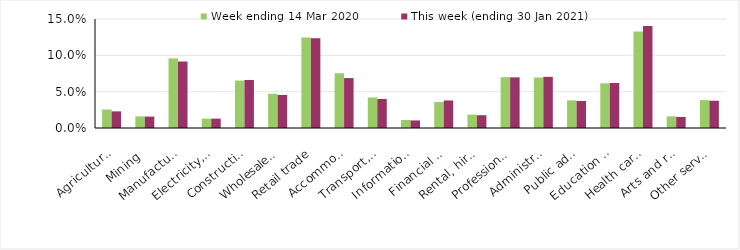
| Category | Week ending 14 Mar 2020 | This week (ending 30 Jan 2021) |
|---|---|---|
| Agriculture, forestry and fishing | 0.025 | 0.023 |
| Mining | 0.016 | 0.016 |
| Manufacturing | 0.096 | 0.092 |
| Electricity, gas, water and waste services | 0.013 | 0.013 |
| Construction | 0.065 | 0.066 |
| Wholesale trade | 0.047 | 0.046 |
| Retail trade | 0.125 | 0.124 |
| Accommodation and food services | 0.075 | 0.069 |
| Transport, postal and warehousing | 0.042 | 0.04 |
| Information media and telecommunications | 0.011 | 0.01 |
| Financial and insurance services | 0.036 | 0.038 |
| Rental, hiring and real estate services | 0.018 | 0.018 |
| Professional, scientific and technical services | 0.07 | 0.07 |
| Administrative and support services | 0.07 | 0.07 |
| Public administration and safety | 0.038 | 0.037 |
| Education and training | 0.062 | 0.062 |
| Health care and social assistance | 0.133 | 0.14 |
| Arts and recreation services | 0.016 | 0.015 |
| Other services | 0.038 | 0.038 |